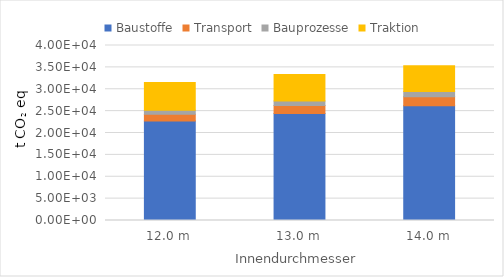
| Category | Baustoffe | Transport | Bauprozesse | Traktion |
|---|---|---|---|---|
| 0 | 22732.814 | 1559.775 | 886.333 | 6351.698 |
| 1 | 24481.491 | 1795.185 | 1027.937 | 6076.691 |
| 2 | 26230.169 | 2047.084 | 1180.029 | 5903.196 |